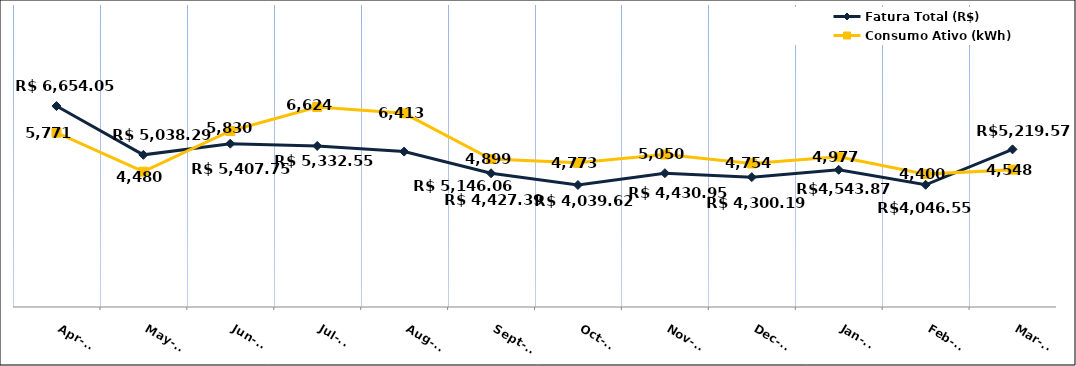
| Category | Fatura Total (R$) |
|---|---|
| 2022-04-01 | 6654.05 |
| 2022-05-01 | 5038.29 |
| 2022-06-01 | 5407.75 |
| 2022-07-01 | 5332.55 |
| 2022-08-01 | 5146.06 |
| 2022-09-01 | 4427.39 |
| 2022-10-01 | 4039.62 |
| 2022-11-01 | 4430.95 |
| 2022-12-01 | 4300.19 |
| 2023-01-01 | 4543.87 |
| 2023-02-01 | 4046.55 |
| 2023-03-01 | 5219.57 |